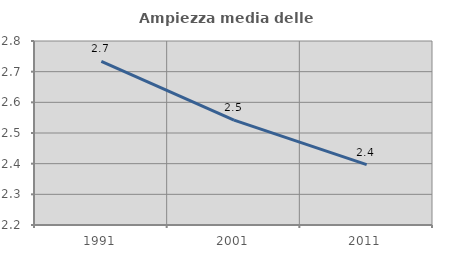
| Category | Ampiezza media delle famiglie |
|---|---|
| 1991.0 | 2.734 |
| 2001.0 | 2.542 |
| 2011.0 | 2.397 |